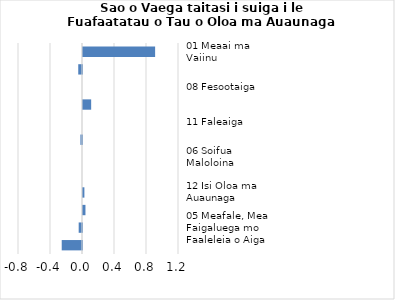
| Category |     Contributions |
|---|---|
| 01 Meaai ma Vaiinu | 0.902 |
| 04 Fale, Vai, Eletise, Kesi ma isi | -0.047 |
| 08 Fesootaiga | 0 |
| 02 Ava Malosi ma Tapaa | 0.102 |
| 11 Faleaiga | 0 |
| 10 Aoaoga | -0.02 |
| 06 Soifua Maloloina | 0 |
| 09 Faafiafiaga ma Aganuu | 0 |
| 12 Isi Oloa ma Auaunaga | 0.017 |
| 03 Lavalava ma Seevae | 0.031 |
| 05 Meafale, Mea Faigaluega mo Faaleleia o Aiga | -0.041 |
| 07 Femalagaiga | -0.254 |